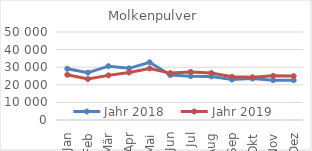
| Category | Jahr 2018 | Jahr 2019 |
|---|---|---|
| Jan | 29148.997 | 25728.274 |
| Feb | 26918.846 | 23302.15 |
| Mär | 30580.83 | 25360.739 |
| Apr | 29354.783 | 26958.124 |
| Mai | 32769.59 | 29309.46 |
| Jun | 25528.547 | 26646.149 |
| Jul | 24922.074 | 27302.548 |
| Aug | 24773.935 | 26662.757 |
| Sep | 22951.326 | 24559.42 |
| Okt | 23555.697 | 24285.837 |
| Nov | 22624.161 | 25081.925 |
| Dez | 22615.955 | 24968.707 |